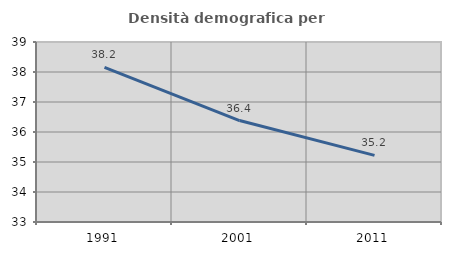
| Category | Densità demografica |
|---|---|
| 1991.0 | 38.154 |
| 2001.0 | 36.382 |
| 2011.0 | 35.219 |